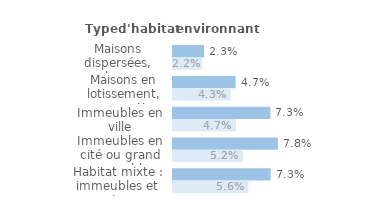
| Category | Series 1 | Series 0 |
|---|---|---|
| Maisons dispersées, hors agglomération | 0.023 | 0.022 |
| Maisons en lotissement, en quartier pavillonnaire | 0.047 | 0.043 |
| Immeubles en ville | 0.073 | 0.047 |
| Immeubles en cité ou grand ensemble | 0.078 | 0.052 |
| Habitat mixte : immeubles et maisons | 0.073 | 0.056 |